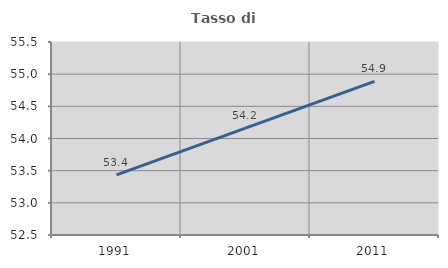
| Category | Tasso di occupazione   |
|---|---|
| 1991.0 | 53.434 |
| 2001.0 | 54.162 |
| 2011.0 | 54.887 |